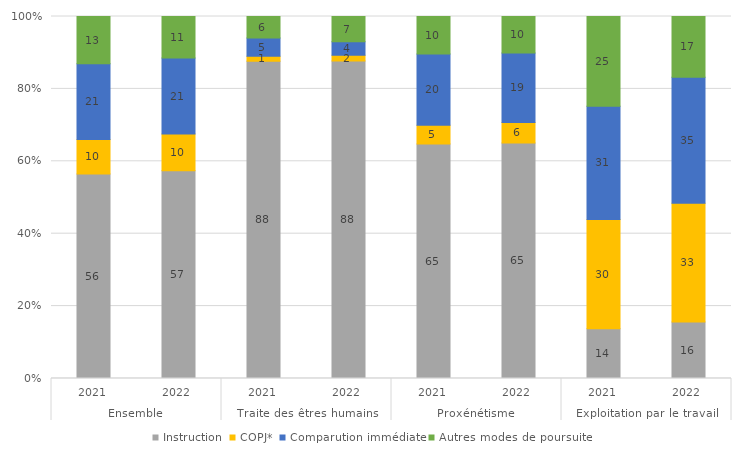
| Category | Instruction | COPJ* | Comparution immédiate | Autres modes de poursuite |
|---|---|---|---|---|
| 0 | 56.464 | 9.569 | 20.913 | 13.054 |
| 1 | 57.378 | 10.145 | 21.014 | 11.462 |
| 2 | 87.615 | 1.376 | 5.046 | 5.963 |
| 3 | 87.701 | 1.604 | 3.743 | 6.952 |
| 4 | 64.753 | 5.174 | 19.725 | 10.348 |
| 5 | 65.075 | 5.611 | 19.263 | 10.05 |
| 6 | 13.74 | 30.153 | 31.298 | 24.809 |
| 7 | 15.6 | 32.8 | 34.8 | 16.8 |